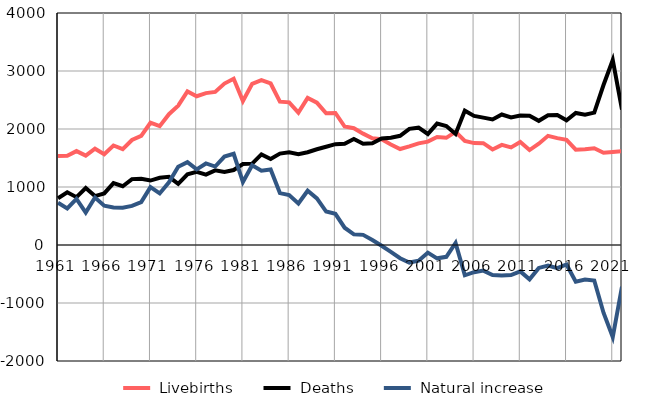
| Category |  Livebirths |  Deaths |  Natural increase |
|---|---|---|---|
| 1961.0 | 1533 | 805 | 728 |
| 1962.0 | 1539 | 909 | 630 |
| 1963.0 | 1619 | 825 | 794 |
| 1964.0 | 1542 | 982 | 560 |
| 1965.0 | 1661 | 843 | 818 |
| 1966.0 | 1566 | 889 | 677 |
| 1967.0 | 1716 | 1068 | 648 |
| 1968.0 | 1654 | 1013 | 641 |
| 1969.0 | 1810 | 1136 | 674 |
| 1970.0 | 1881 | 1142 | 739 |
| 1971.0 | 2108 | 1111 | 997 |
| 1972.0 | 2049 | 1160 | 889 |
| 1973.0 | 2255 | 1175 | 1080 |
| 1974.0 | 2402 | 1053 | 1349 |
| 1975.0 | 2648 | 1219 | 1429 |
| 1976.0 | 2565 | 1261 | 1304 |
| 1977.0 | 2619 | 1213 | 1406 |
| 1978.0 | 2640 | 1287 | 1353 |
| 1979.0 | 2783 | 1258 | 1525 |
| 1980.0 | 2865 | 1293 | 1572 |
| 1981.0 | 2482 | 1396 | 1086 |
| 1982.0 | 2779 | 1403 | 1376 |
| 1983.0 | 2844 | 1562 | 1282 |
| 1984.0 | 2785 | 1482 | 1303 |
| 1985.0 | 2471 | 1576 | 895 |
| 1986.0 | 2460 | 1598 | 862 |
| 1987.0 | 2283 | 1566 | 717 |
| 1988.0 | 2536 | 1600 | 936 |
| 1989.0 | 2455 | 1651 | 804 |
| 1990.0 | 2271 | 1694 | 577 |
| 1991.0 | 2276 | 1739 | 537 |
| 1992.0 | 2043 | 1745 | 298 |
| 1993.0 | 2013 | 1828 | 185 |
| 1994.0 | 1920 | 1745 | 175 |
| 1995.0 | 1841 | 1755 | 86 |
| 1996.0 | 1823 | 1836 | -13 |
| 1997.0 | 1733 | 1850 | -117 |
| 1998.0 | 1655 | 1883 | -228 |
| 1999.0 | 1699 | 2002 | -303 |
| 2000.0 | 1752 | 2023 | -271 |
| 2001.0 | 1782 | 1914 | -132 |
| 2002.0 | 1863 | 2093 | -230 |
| 2003.0 | 1848 | 2052 | -204 |
| 2004.0 | 1950 | 1915 | 35 |
| 2005.0 | 1794 | 2316 | -522 |
| 2006.0 | 1757 | 2226 | -469 |
| 2007.0 | 1755 | 2196 | -441 |
| 2008.0 | 1647 | 2164 | -517 |
| 2009.0 | 1726 | 2250 | -524 |
| 2010.0 | 1682 | 2201 | -519 |
| 2011.0 | 1777 | 2232 | -455 |
| 2012.0 | 1637 | 2229 | -592 |
| 2013.0 | 1746 | 2141 | -395 |
| 2014.0 | 1882 | 2237 | -355 |
| 2015.0 | 1842 | 2241 | -399 |
| 2016.0 | 1814 | 2150 | -336 |
| 2017.0 | 1644 | 2277 | -633 |
| 2018.0 | 1652 | 2246 | -594 |
| 2019.0 | 1669 | 2282 | -613 |
| 2020.0 | 1591 | 2758 | -1167 |
| 2021.0 | 1604 | 3190 | -1586 |
| 2022.0 | 1619 | 2336 | -717 |